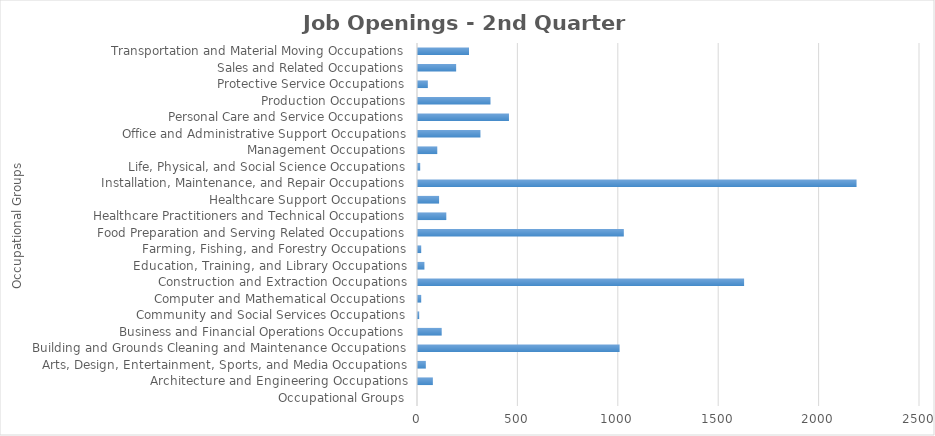
| Category | Series1 |
|---|---|
| Occupational Groups | 0 |
| Architecture and Engineering Occupations | 74 |
| Arts, Design, Entertainment, Sports, and Media Occupations | 39 |
| Building and Grounds Cleaning and Maintenance Occupations | 1004 |
| Business and Financial Operations Occupations | 118 |
| Community and Social Services Occupations | 6 |
| Computer and Mathematical Occupations | 16 |
| Construction and Extraction Occupations | 1624 |
| Education, Training, and Library Occupations | 32 |
| Farming, Fishing, and Forestry Occupations | 16 |
| Food Preparation and Serving Related Occupations | 1025 |
| Healthcare Practitioners and Technical Occupations | 141 |
| Healthcare Support Occupations | 105 |
| Installation, Maintenance, and Repair Occupations | 2184 |
| Life, Physical, and Social Science Occupations | 11 |
| Management Occupations | 96 |
| Office and Administrative Support Occupations | 311 |
| Personal Care and Service Occupations | 453 |
| Production Occupations | 361 |
| Protective Service Occupations | 49 |
| Sales and Related Occupations | 190 |
| Transportation and Material Moving Occupations | 254 |